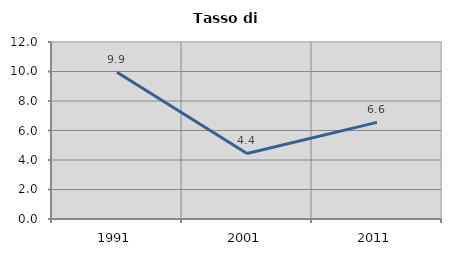
| Category | Tasso di disoccupazione   |
|---|---|
| 1991.0 | 9.944 |
| 2001.0 | 4.444 |
| 2011.0 | 6.551 |